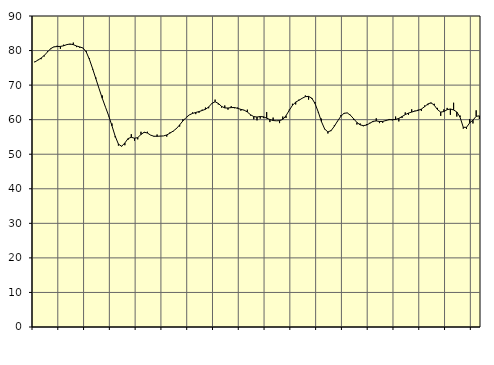
| Category | Piggar | Series 1 |
|---|---|---|
| nan | 76.8 | 76.65 |
| 87.0 | 77.3 | 77.22 |
| 87.0 | 77.5 | 77.82 |
| 87.0 | 78.3 | 78.58 |
| nan | 79.8 | 79.6 |
| 88.0 | 80.4 | 80.57 |
| 88.0 | 81 | 81.07 |
| 88.0 | 81.4 | 81.16 |
| nan | 80.5 | 81.2 |
| 89.0 | 81.7 | 81.38 |
| 89.0 | 81.8 | 81.72 |
| 89.0 | 81.7 | 81.9 |
| nan | 82.3 | 81.71 |
| 90.0 | 81 | 81.32 |
| 90.0 | 80.8 | 81.05 |
| 90.0 | 80.7 | 80.75 |
| nan | 79.9 | 79.63 |
| 91.0 | 77.8 | 77.47 |
| 91.0 | 74.5 | 74.74 |
| 91.0 | 72.2 | 71.86 |
| nan | 69 | 68.99 |
| 92.0 | 67 | 66.18 |
| 92.0 | 63.6 | 63.6 |
| 92.0 | 61 | 61.09 |
| nan | 58.9 | 58.22 |
| 93.0 | 54.9 | 55.22 |
| 93.0 | 52.5 | 52.93 |
| 93.0 | 52.4 | 52.29 |
| nan | 52.6 | 53.26 |
| 94.0 | 54.2 | 54.53 |
| 94.0 | 55.8 | 54.9 |
| 94.0 | 53.9 | 54.63 |
| nan | 54.3 | 54.81 |
| 95.0 | 56.5 | 55.71 |
| 95.0 | 56.2 | 56.37 |
| 95.0 | 56.5 | 56.13 |
| nan | 55.5 | 55.53 |
| 96.0 | 55.1 | 55.21 |
| 96.0 | 55.7 | 55.19 |
| 96.0 | 55.3 | 55.24 |
| nan | 55.3 | 55.3 |
| 97.0 | 55.1 | 55.58 |
| 97.0 | 56.3 | 56.11 |
| 97.0 | 56.6 | 56.7 |
| nan | 57.3 | 57.43 |
| 98.0 | 58 | 58.48 |
| 98.0 | 60.1 | 59.63 |
| 98.0 | 60.6 | 60.6 |
| nan | 61.4 | 61.37 |
| 99.0 | 62.1 | 61.81 |
| 99.0 | 61.6 | 62.09 |
| 99.0 | 62 | 62.34 |
| nan | 62.9 | 62.66 |
| 0.0 | 63.5 | 63 |
| 0.0 | 63.3 | 63.66 |
| 0.0 | 64.6 | 64.71 |
| nan | 65.8 | 65.19 |
| 1.0 | 64.4 | 64.7 |
| 1.0 | 63.5 | 63.85 |
| 1.0 | 64.1 | 63.4 |
| nan | 62.9 | 63.37 |
| 2.0 | 63.9 | 63.49 |
| 2.0 | 63.3 | 63.52 |
| 2.0 | 63.5 | 63.27 |
| nan | 62.6 | 62.98 |
| 3.0 | 62.7 | 62.77 |
| 3.0 | 62.9 | 62.21 |
| 3.0 | 61.2 | 61.42 |
| nan | 60.1 | 60.89 |
| 4.0 | 59.8 | 60.76 |
| 4.0 | 60.3 | 60.92 |
| 4.0 | 60.5 | 60.83 |
| nan | 62.2 | 60.43 |
| 5.0 | 59.3 | 60.04 |
| 5.0 | 60.6 | 59.75 |
| 5.0 | 59.7 | 59.67 |
| nan | 59 | 59.72 |
| 6.0 | 60.9 | 60.07 |
| 6.0 | 60.5 | 61.14 |
| 6.0 | 62.9 | 62.7 |
| nan | 64.6 | 64.15 |
| 7.0 | 64.4 | 65.08 |
| 7.0 | 65.8 | 65.6 |
| 7.0 | 66.2 | 66.18 |
| nan | 67 | 66.65 |
| 8.0 | 65.8 | 66.74 |
| 8.0 | 66 | 66.24 |
| 8.0 | 65.1 | 64.67 |
| nan | 62.1 | 62.24 |
| 9.0 | 60.3 | 59.42 |
| 9.0 | 57.2 | 57.29 |
| 9.0 | 56 | 56.44 |
| nan | 56.7 | 56.85 |
| 10.0 | 58.4 | 58.1 |
| 10.0 | 59.5 | 59.6 |
| 10.0 | 61.3 | 60.95 |
| nan | 61.7 | 61.85 |
| 11.0 | 62 | 61.95 |
| 11.0 | 61.4 | 61.28 |
| 11.0 | 59.9 | 60.24 |
| nan | 58.6 | 59.19 |
| 12.0 | 58.9 | 58.49 |
| 12.0 | 58.1 | 58.28 |
| 12.0 | 58.7 | 58.44 |
| nan | 59.1 | 58.95 |
| 13.0 | 59.3 | 59.51 |
| 13.0 | 60.4 | 59.64 |
| 13.0 | 59 | 59.47 |
| nan | 59.1 | 59.49 |
| 14.0 | 59.6 | 59.76 |
| 14.0 | 60.2 | 59.99 |
| 14.0 | 59.8 | 60 |
| nan | 60.9 | 60.05 |
| 15.0 | 59.5 | 60.38 |
| 15.0 | 60.5 | 60.9 |
| 15.0 | 62.1 | 61.46 |
| nan | 61.4 | 61.9 |
| 16.0 | 63 | 62.2 |
| 16.0 | 62.6 | 62.48 |
| 16.0 | 62.9 | 62.68 |
| nan | 62.5 | 63.07 |
| 17.0 | 64.1 | 63.76 |
| 17.0 | 64.2 | 64.54 |
| 17.0 | 64.7 | 64.89 |
| nan | 64.6 | 64.18 |
| 18.0 | 63.4 | 62.91 |
| 18.0 | 61.1 | 62.19 |
| 18.0 | 63 | 62.35 |
| nan | 63.4 | 62.89 |
| 19.0 | 61.4 | 63.09 |
| 19.0 | 64.9 | 62.81 |
| 19.0 | 60.9 | 62.23 |
| nan | 61.2 | 60.73 |
| 20.0 | 57.4 | 57.79 |
| 20.0 | 57.3 | 57.78 |
| 20.0 | 60.2 | 59.07 |
| nan | 58.9 | 59.87 |
| 21.0 | 62.7 | 60.97 |
| 21.0 | 60.2 | 61.1 |